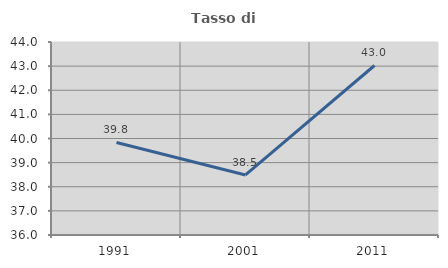
| Category | Tasso di occupazione   |
|---|---|
| 1991.0 | 39.835 |
| 2001.0 | 38.488 |
| 2011.0 | 43.026 |